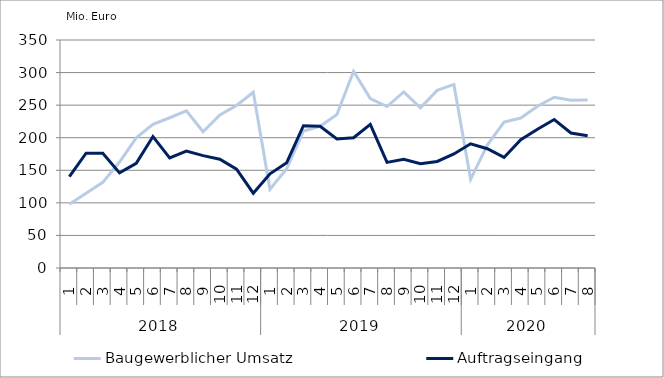
| Category | Baugewerblicher Umsatz | Auftragseingang |
|---|---|---|
| 0 | 97959.056 | 140119.385 |
| 1 | 114756.787 | 176330.213 |
| 2 | 131454.642 | 176241.061 |
| 3 | 162648.053 | 146063.407 |
| 4 | 199809.407 | 160551.931 |
| 5 | 220535.974 | 201835.846 |
| 6 | 230672.472 | 169132.23 |
| 7 | 241233.619 | 179396.293 |
| 8 | 209099.292 | 172542.764 |
| 9 | 234953.007 | 166991.729 |
| 10 | 249410.043 | 151835.629 |
| 11 | 269773.227 | 114807.456 |
| 12 | 120975.133 | 144510.881 |
| 13 | 152329.786 | 161685.201 |
| 14 | 210227.67 | 218455.879 |
| 15 | 217522.321 | 217610.064 |
| 16 | 235490.429 | 198110.439 |
| 17 | 301963.302 | 200012.086 |
| 18 | 259975.317 | 220559.061 |
| 19 | 247779.658 | 162059.723 |
| 20 | 270249.609 | 166829.611 |
| 21 | 245966.91 | 160120.773 |
| 22 | 272620.351 | 163589.389 |
| 23 | 281810.121 | 175051.247 |
| 24 | 136135.432 | 190647.086 |
| 25 | 188682.361 | 183141.14 |
| 26 | 224009.315 | 169770.009 |
| 27 | 230172.252 | 196979.845 |
| 28 | 248410.714 | 212955.83 |
| 29 | 262078.128 | 227853.487 |
| 30 | 257360.37 | 207209.188 |
| 31 | 257932.168 | 202976.091 |